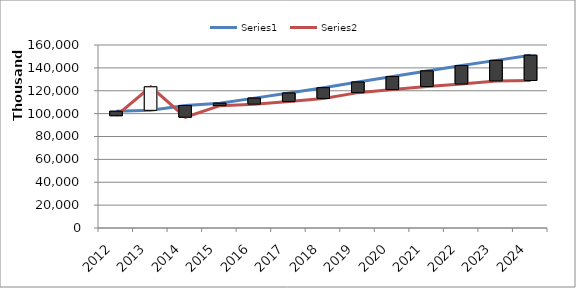
| Category | Series 0 | Series 1 |
|---|---|---|
| 2012.0 | 102101373.5 | 98182288.1 |
| 2013.0 | 102891930.3 | 123444031.94 |
| 2014.0 | 107100203.64 | 96876666.03 |
| 2015.0 | 109088480 | 106992174 |
| 2016.0 | 113538641 | 108281643 |
| 2017.0 | 117966648 | 110530972 |
| 2018.0 | 122685314 | 113264977 |
| 2019.0 | 127592727 | 118355238 |
| 2020.0 | 132441251 | 121006865 |
| 2021.0 | 137341577 | 123724608 |
| 2022.0 | 142011191 | 125855292 |
| 2023.0 | 146555549 | 128586817 |
| 2024.0 | 151098771 | 128983540 |